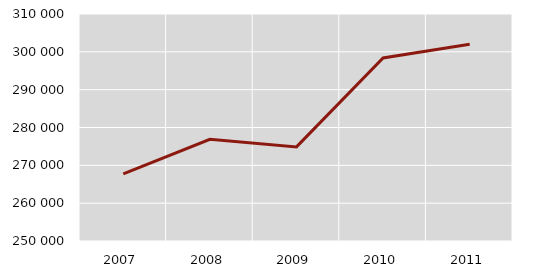
| Category | УКУПНО |
|---|---|
| 2007.0 | 267716 |
| 2008.0 | 276885 |
| 2009.0 | 274874 |
| 2010.0 | 298364 |
| 2011.0 | 302004 |